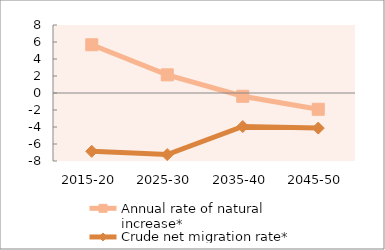
| Category | Annual rate of natural increase* | Crude net migration rate* |
|---|---|---|
| 2015-20 | 5.677 | -6.861 |
| 2025-30 | 2.135 | -7.244 |
| 2035-40 | -0.383 | -3.942 |
| 2045-50 | -1.915 | -4.128 |